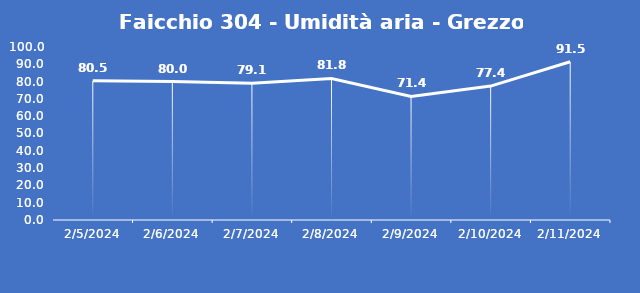
| Category | Faicchio 304 - Umidità aria - Grezzo (%) |
|---|---|
| 2/5/24 | 80.5 |
| 2/6/24 | 80 |
| 2/7/24 | 79.1 |
| 2/8/24 | 81.8 |
| 2/9/24 | 71.4 |
| 2/10/24 | 77.4 |
| 2/11/24 | 91.5 |